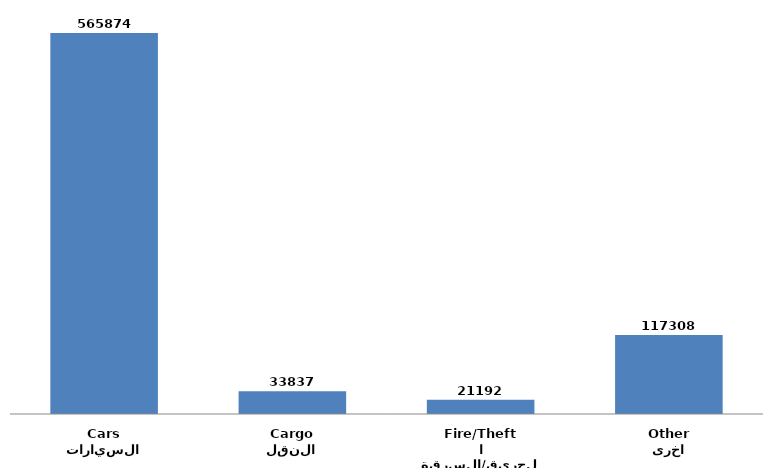
| Category | Series 0 |
|---|---|
| السيارات
Cars | 565874 |
| النقل
Cargo | 33837 |
| الحريق/السرقة
Fire/Theft | 21192 |
| اخرى
Other | 117308 |